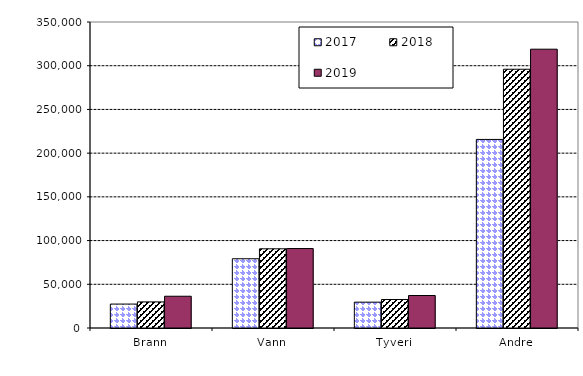
| Category | 2017 | 2018 | 2019 |
|---|---|---|---|
| Brann | 27370.063 | 29861.201 | 36333.151 |
| Vann | 79211.787 | 90583.531 | 90885.235 |
| Tyveri | 29554.494 | 32604.24 | 37173.079 |
| Andre | 215684.233 | 295967.064 | 318893.277 |